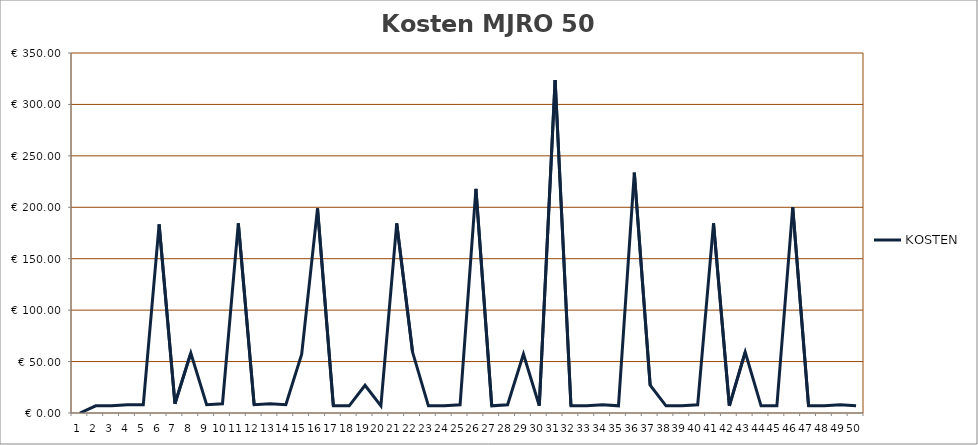
| Category | KOSTEN |
|---|---|
| 0 | 0 |
| 1 | 7 |
| 2 | 7 |
| 3 | 8 |
| 4 | 8 |
| 5 | 183.4 |
| 6 | 9 |
| 7 | 58.25 |
| 8 | 8 |
| 9 | 9 |
| 10 | 184.4 |
| 11 | 8 |
| 12 | 9 |
| 13 | 8 |
| 14 | 57.25 |
| 15 | 198.9 |
| 16 | 7 |
| 17 | 7 |
| 18 | 27 |
| 19 | 7 |
| 20 | 184.4 |
| 21 | 59.25 |
| 22 | 7 |
| 23 | 7 |
| 24 | 8 |
| 25 | 217.9 |
| 26 | 7 |
| 27 | 8 |
| 28 | 57.25 |
| 29 | 7 |
| 30 | 323.8 |
| 31 | 7 |
| 32 | 7 |
| 33 | 8 |
| 34 | 7 |
| 35 | 233.65 |
| 36 | 27 |
| 37 | 7 |
| 38 | 7 |
| 39 | 8 |
| 40 | 184.4 |
| 41 | 7 |
| 42 | 59.25 |
| 43 | 7 |
| 44 | 7 |
| 45 | 199.9 |
| 46 | 7 |
| 47 | 7 |
| 48 | 8 |
| 49 | 7 |